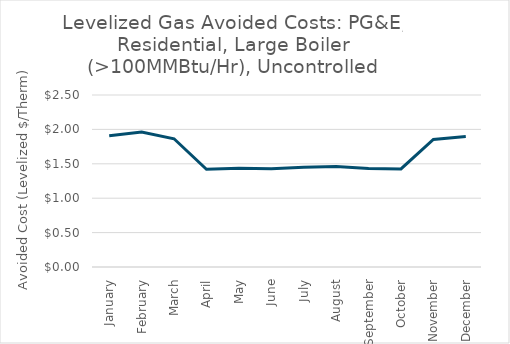
| Category | New Total |
|---|---|
| January | 1.908 |
| February | 1.963 |
| March | 1.864 |
| April | 1.42 |
| May | 1.437 |
| June | 1.429 |
| July | 1.449 |
| August | 1.461 |
| September | 1.43 |
| October | 1.425 |
| November | 1.854 |
| December | 1.898 |